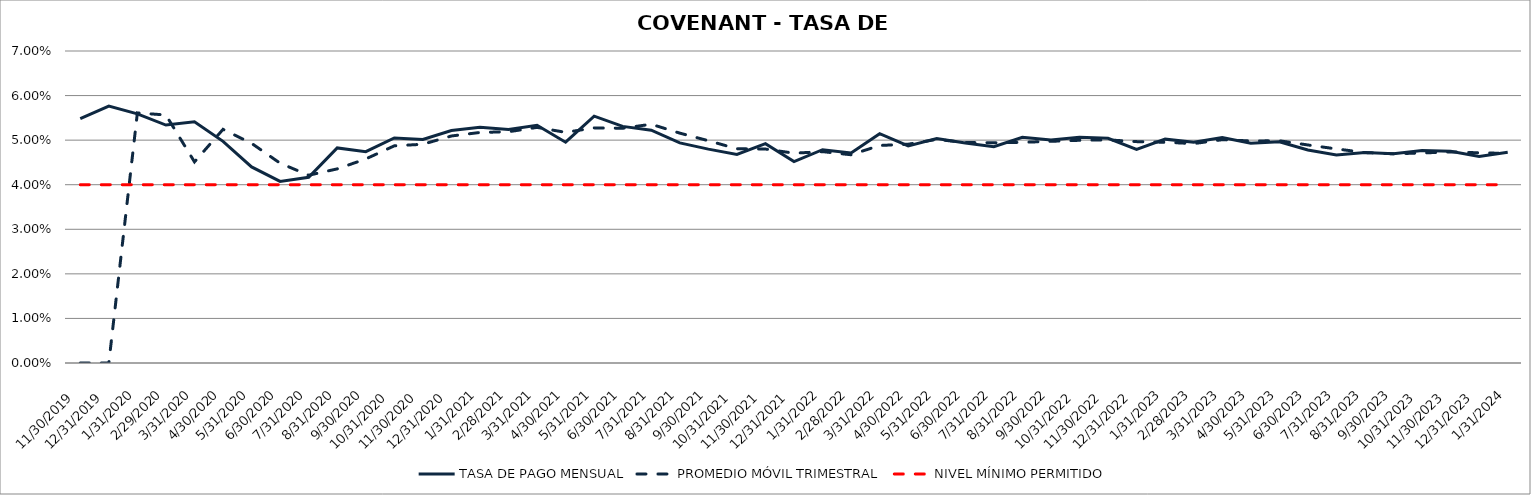
| Category | TASA DE PAGO MENSUAL | PROMEDIO MÓVIL TRIMESTRAL | NIVEL MÍNIMO PERMITIDO |
|---|---|---|---|
| 11/30/19 | 0.055 | 0 | 0.04 |
| 12/31/19 | 0.058 | 0 | 0.04 |
| 1/31/20 | 0.056 | 0.056 | 0.04 |
| 2/29/20 | 0.053 | 0.056 | 0.04 |
| 3/31/20 | 0.054 | 0.045 | 0.04 |
| 4/30/20 | 0.05 | 0.052 | 0.04 |
| 5/31/20 | 0.044 | 0.049 | 0.04 |
| 6/30/20 | 0.041 | 0.045 | 0.04 |
| 7/31/20 | 0.042 | 0.042 | 0.04 |
| 8/31/20 | 0.048 | 0.044 | 0.04 |
| 9/30/20 | 0.047 | 0.046 | 0.04 |
| 10/31/20 | 0.051 | 0.049 | 0.04 |
| 11/30/20 | 0.05 | 0.049 | 0.04 |
| 12/31/20 | 0.052 | 0.051 | 0.04 |
| 1/31/21 | 0.053 | 0.052 | 0.04 |
| 2/28/21 | 0.052 | 0.052 | 0.04 |
| 3/31/21 | 0.053 | 0.053 | 0.04 |
| 4/30/21 | 0.05 | 0.052 | 0.04 |
| 5/31/21 | 0.055 | 0.053 | 0.04 |
| 6/30/21 | 0.053 | 0.053 | 0.04 |
| 7/31/21 | 0.052 | 0.054 | 0.04 |
| 8/31/21 | 0.049 | 0.052 | 0.04 |
| 9/30/21 | 0.048 | 0.05 | 0.04 |
| 10/31/21 | 0.047 | 0.048 | 0.04 |
| 11/30/21 | 0.049 | 0.048 | 0.04 |
| 12/31/21 | 0.045 | 0.047 | 0.04 |
| 1/31/22 | 0.048 | 0.047 | 0.04 |
| 2/28/22 | 0.047 | 0.047 | 0.04 |
| 3/31/22 | 0.051 | 0.049 | 0.04 |
| 4/30/22 | 0.049 | 0.049 | 0.04 |
| 5/31/22 | 0.05 | 0.05 | 0.04 |
| 6/30/22 | 0.049 | 0.049 | 0.04 |
| 7/31/22 | 0.049 | 0.049 | 0.04 |
| 8/31/22 | 0.051 | 0.05 | 0.04 |
| 9/30/22 | 0.05 | 0.05 | 0.04 |
| 10/31/22 | 0.051 | 0.05 | 0.04 |
| 11/30/22 | 0.05 | 0.05 | 0.04 |
| 12/31/22 | 0.048 | 0.05 | 0.04 |
| 1/31/23 | 0.05 | 0.05 | 0.04 |
| 2/28/23 | 0.05 | 0.049 | 0.04 |
| 3/31/23 | 0.051 | 0.05 | 0.04 |
| 4/30/23 | 0.049 | 0.05 | 0.04 |
| 5/31/23 | 0.05 | 0.05 | 0.04 |
| 6/30/23 | 0.048 | 0.049 | 0.04 |
| 7/31/23 | 0.047 | 0.048 | 0.04 |
| 8/31/23 | 0.047 | 0.047 | 0.04 |
| 9/30/23 | 0.047 | 0.047 | 0.04 |
| 10/31/23 | 0.048 | 0.047 | 0.04 |
| 11/30/23 | 0.047 | 0.047 | 0.04 |
| 12/31/23 | 0.046 | 0.047 | 0.04 |
| 1/31/24 | 0.047 | 0.047 | 0.04 |